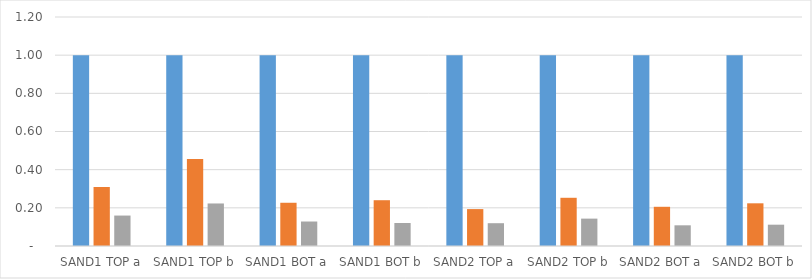
| Category | 1 | 0.2 | 0.1 |
|---|---|---|---|
| SAND1 TOP a | 1 | 0.309 | 0.16 |
| SAND1 TOP b | 1 | 0.455 | 0.223 |
| SAND1 BOT a | 1 | 0.227 | 0.128 |
| SAND1 BOT b | 1 | 0.24 | 0.12 |
| SAND2 TOP a | 1 | 0.193 | 0.119 |
| SAND2 TOP b | 1 | 0.253 | 0.143 |
| SAND2 BOT a | 1 | 0.205 | 0.108 |
| SAND2 BOT b | 1 | 0.224 | 0.112 |